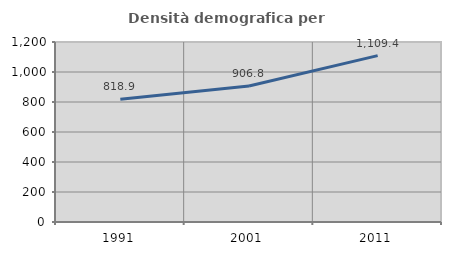
| Category | Densità demografica |
|---|---|
| 1991.0 | 818.947 |
| 2001.0 | 906.825 |
| 2011.0 | 1109.38 |